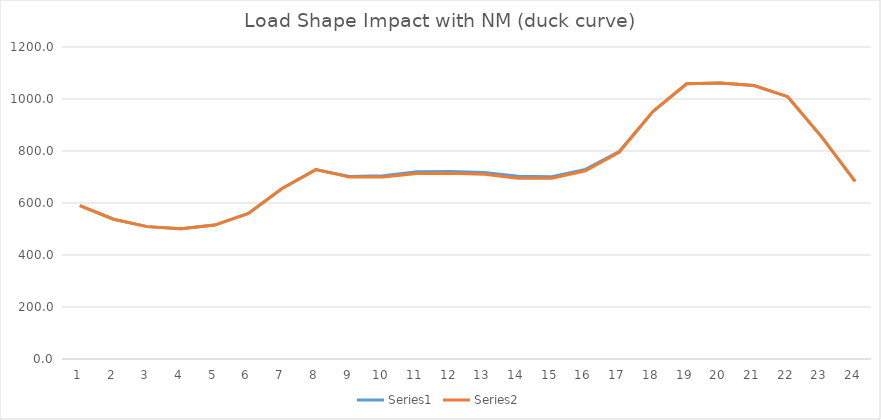
| Category | Series 0 | Series 1 |
|---|---|---|
| 0 | 589.788 | 589.788 |
| 1 | 537.686 | 537.686 |
| 2 | 509.14 | 509.14 |
| 3 | 500.571 | 500.571 |
| 4 | 515.05 | 515.05 |
| 5 | 560.145 | 560.145 |
| 6 | 656.06 | 656.06 |
| 7 | 728.498 | 728.448 |
| 8 | 701.767 | 699.558 |
| 9 | 704.953 | 700.306 |
| 10 | 719.731 | 713.773 |
| 11 | 721.48 | 714.461 |
| 12 | 717.677 | 710.799 |
| 13 | 702.594 | 695.645 |
| 14 | 701.318 | 694.861 |
| 15 | 729.222 | 724.138 |
| 16 | 798.099 | 795.149 |
| 17 | 952.102 | 951.567 |
| 18 | 1058.649 | 1058.649 |
| 19 | 1061.093 | 1061.093 |
| 20 | 1051.614 | 1051.614 |
| 21 | 1008.844 | 1008.844 |
| 22 | 855.182 | 855.182 |
| 23 | 683.502 | 683.502 |